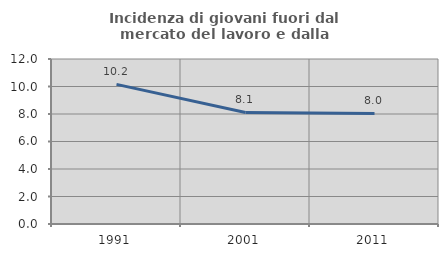
| Category | Incidenza di giovani fuori dal mercato del lavoro e dalla formazione  |
|---|---|
| 1991.0 | 10.156 |
| 2001.0 | 8.115 |
| 2011.0 | 8.04 |